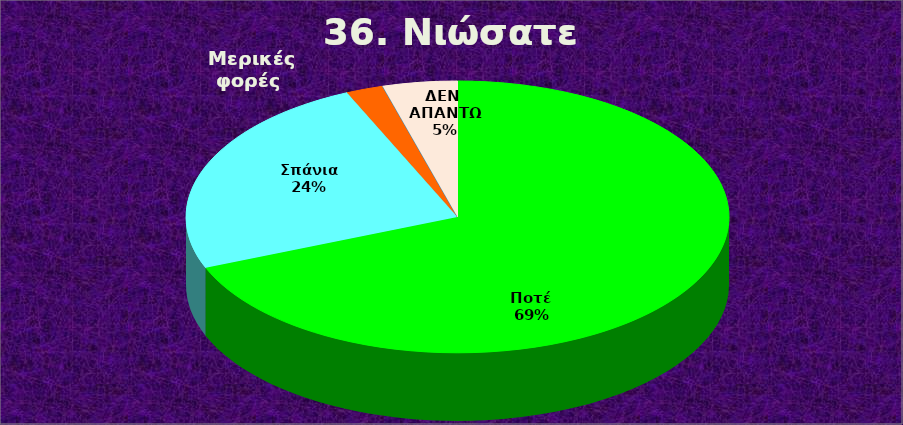
| Category | Series 0 |
|---|---|
| Ποτέ  | 31 |
| Σπάνια  | 11 |
| Μερικές φορές  | 1 |
| Συχνά  | 0 |
| Συνήθως  | 0 |
| ΔΕΝ ΑΠΑΝΤΩ | 2 |